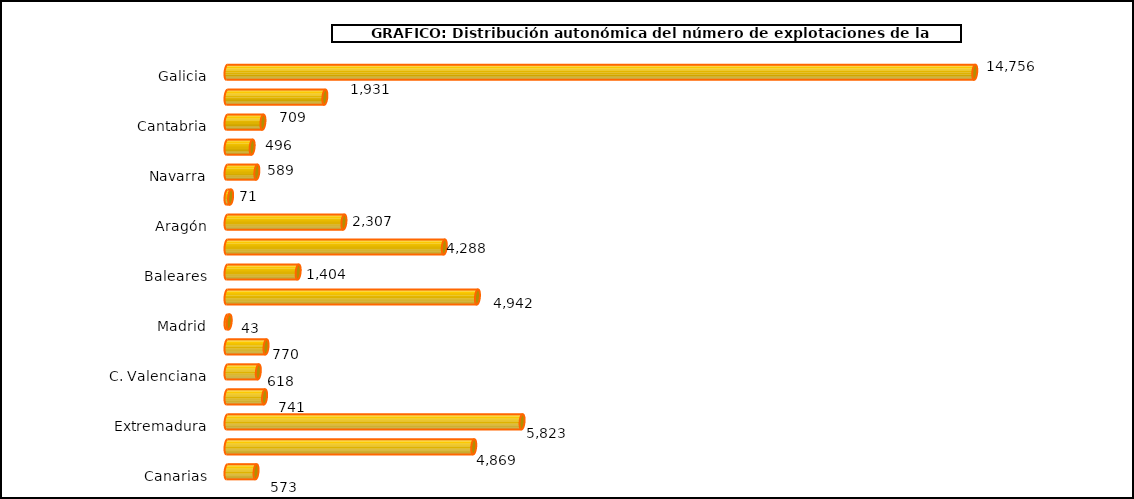
| Category | num. Explotaciones |
|---|---|
|   Galicia | 14756 |
|   P. de Asturias | 1931 |
|   Cantabria | 709 |
|   País Vasco | 496 |
|   Navarra | 589 |
|   La Rioja | 71 |
|   Aragón | 2307 |
|   Cataluña | 4288 |
|   Baleares | 1404 |
|   Castilla y León | 4942 |
|   Madrid | 43 |
|   Castilla – La Mancha | 770 |
|   C. Valenciana | 618 |
|   R. de Murcia | 741 |
|   Extremadura | 5823 |
|   Andalucía | 4869 |
|   Canarias | 573 |